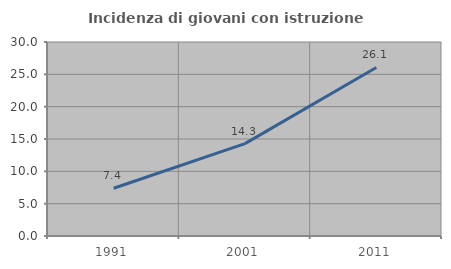
| Category | Incidenza di giovani con istruzione universitaria |
|---|---|
| 1991.0 | 7.386 |
| 2001.0 | 14.286 |
| 2011.0 | 26.064 |